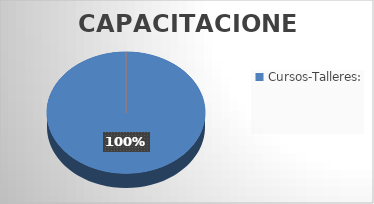
| Category | Series 0 | Series 1 |
|---|---|---|
| Cursos-Talleres: | 2 |  |
| Socializaciones: | 0 |  |
| Charlas | 0 |  |
| Seminarios | 0 |  |